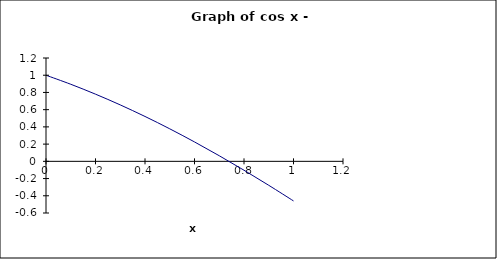
| Category | cos x - x |
|---|---|
| 0.0 | 1 |
| 0.1 | 0.895 |
| 0.2 | 0.78 |
| 0.3 | 0.655 |
| 0.4 | 0.521 |
| 0.5 | 0.378 |
| 0.6 | 0.225 |
| 0.7 | 0.065 |
| 0.8 | -0.103 |
| 0.9 | -0.278 |
| 1.0 | -0.46 |